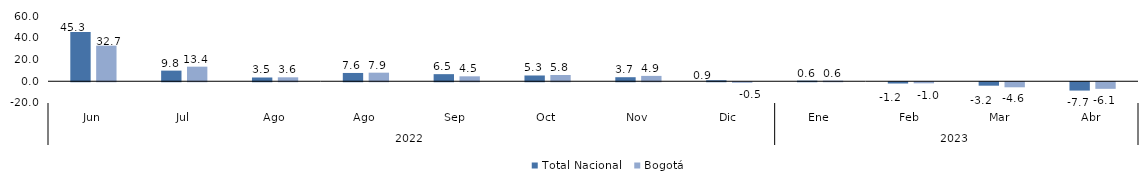
| Category | Total Nacional | Bogotá |
|---|---|---|
| 0 | 45.332 | 32.728 |
| 1 | 9.772 | 13.412 |
| 2 | 3.46 | 3.61 |
| 3 | 7.63 | 7.889 |
| 4 | 6.527 | 4.529 |
| 5 | 5.304 | 5.753 |
| 6 | 3.709 | 4.926 |
| 7 | 0.933 | -0.485 |
| 8 | 0.57 | 0.585 |
| 9 | -1.168 | -1 |
| 10 | -3.158 | -4.637 |
| 11 | -7.651 | -6.05 |